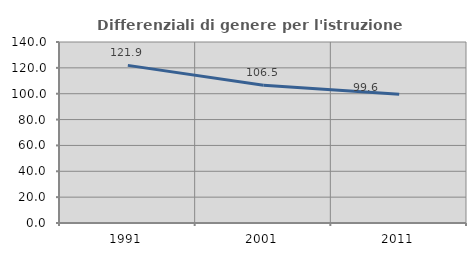
| Category | Differenziali di genere per l'istruzione superiore |
|---|---|
| 1991.0 | 121.909 |
| 2001.0 | 106.523 |
| 2011.0 | 99.578 |